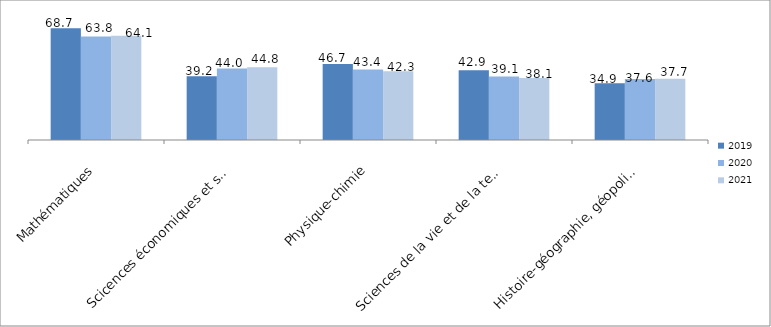
| Category | 2019 | 2020 | 2021 |
|---|---|---|---|
| Mathématiques | 68.7 | 63.753 | 64.1 |
| Scicences économiques et sociales | 39.2 | 44.022 | 44.8 |
| Physique-chimie | 46.7 | 43.369 | 42.3 |
| Sciences de la vie et de la terre | 42.9 | 39.076 | 38.1 |
| Histoire-géographie, géopolitique et sciences politiques | 34.9 | 37.566 | 37.7 |